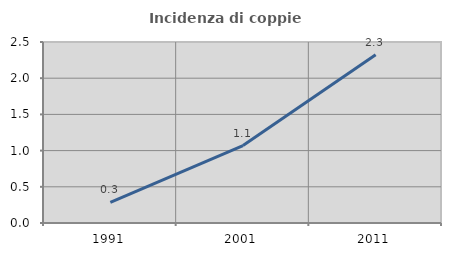
| Category | Incidenza di coppie miste |
|---|---|
| 1991.0 | 0.286 |
| 2001.0 | 1.07 |
| 2011.0 | 2.324 |